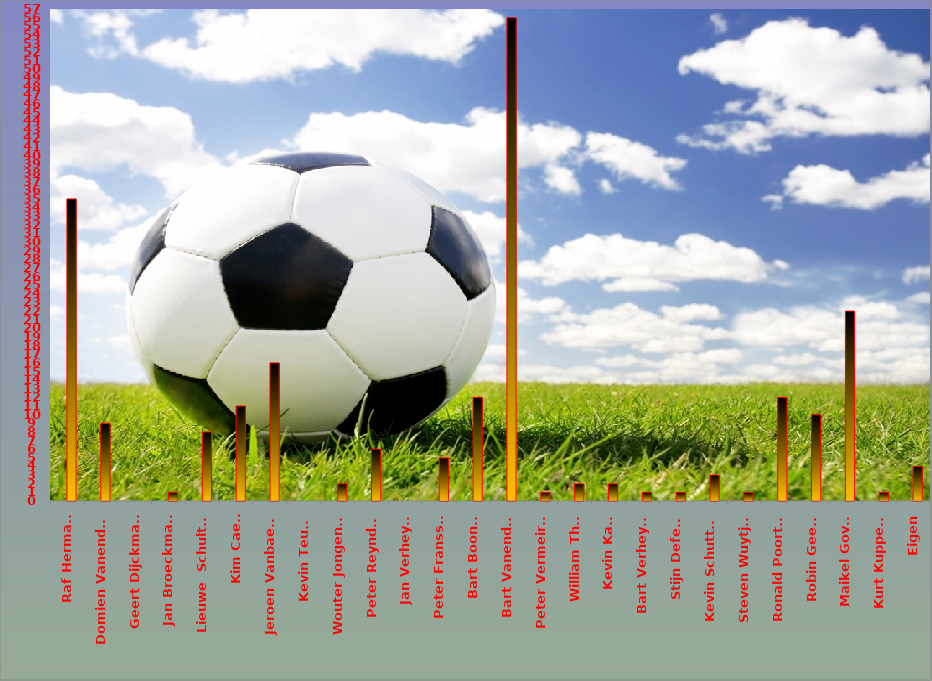
| Category | Series 0 | Series 1 |
|---|---|---|
| Raf Hermans |  | 35 |
| Domien Vanendert  |  | 9 |
| Geert Dijckmans |  | 0 |
| Jan Broeckmans |  | 1 |
| Lieuwe  Schultink |  | 8 |
| Kim Caels |  | 11 |
| Jeroen Vanbaelen |  | 16 |
| Kevin Teuwis |  | 0 |
| Wouter Jongeneel |  | 2 |
| Peter Reynders |  | 6 |
| Jan Verheyen |  | 0 |
| Peter Franssen |  | 5 |
| Bart Boonen |  | 12 |
| Bart Vanendert |  | 56 |
| Peter Vermeiren |  | 1 |
| William Thijs |  | 2 |
| Kevin Kalili |  | 2 |
| Bart Verheyen |  | 1 |
| Stijn Deferm |  | 1 |
| Kevin Schutters |  | 3 |
| Steven Wuytjes |  | 1 |
| Ronald Poorters |  | 12 |
| Robin Geerts |  | 10 |
| Maikel Goven |  | 22 |
| Kurt Kuppens |  | 1 |
| Eigen |  | 4 |